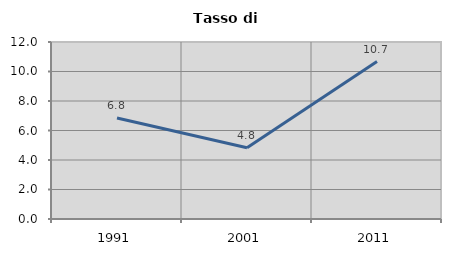
| Category | Tasso di disoccupazione   |
|---|---|
| 1991.0 | 6.844 |
| 2001.0 | 4.833 |
| 2011.0 | 10.676 |